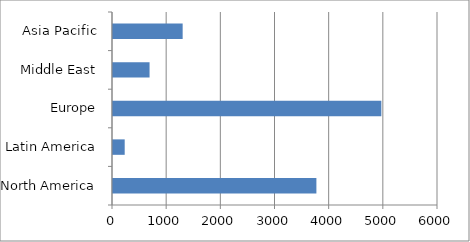
| Category | Series 0 |
|---|---|
| North America | 3755 |
| Latin America | 216 |
| Europe | 4954 |
| Middle East | 675 |
| Asia Pacific | 1286 |